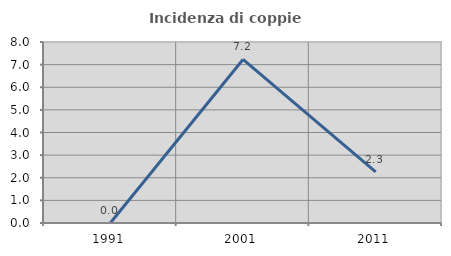
| Category | Incidenza di coppie miste |
|---|---|
| 1991.0 | 0 |
| 2001.0 | 7.229 |
| 2011.0 | 2.26 |